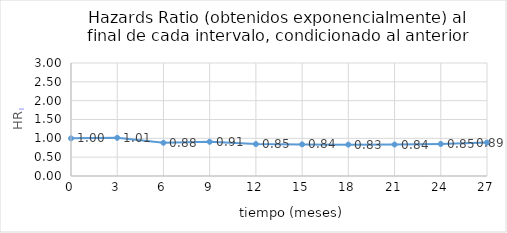
| Category | HRi |
|---|---|
| 0.0 | 1 |
| 3.0 | 1.014 |
| 6.0 | 0.882 |
| 9.0 | 0.908 |
| 12.0 | 0.848 |
| 15.0 | 0.839 |
| 18.0 | 0.833 |
| 21.0 | 0.836 |
| 24.0 | 0.851 |
| 27.0 | 0.887 |